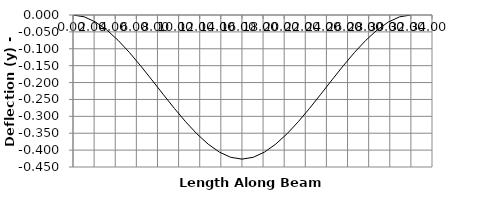
| Category | y |
|---|---|
| 0.0 | 0 |
| 0.0 | 0 |
| 1.0666666666666667 | -0.005 |
| 2.1333333333333333 | -0.021 |
| 3.2 | -0.044 |
| 4.266666666666667 | -0.075 |
| 5.333333333333333 | -0.111 |
| 6.4 | -0.15 |
| 7.466666666666667 | -0.192 |
| 8.533333333333333 | -0.235 |
| 9.6 | -0.276 |
| 10.666666666666666 | -0.316 |
| 11.733333333333333 | -0.352 |
| 12.8 | -0.382 |
| 13.866666666666667 | -0.406 |
| 14.933333333333334 | -0.421 |
| 15.999 | -0.427 |
| 16.0 | -0.427 |
| 16.001 | -0.427 |
| 17.066666666666666 | -0.421 |
| 18.133333333333333 | -0.406 |
| 19.2 | -0.382 |
| 20.266666666666666 | -0.352 |
| 21.333333333333332 | -0.316 |
| 22.4 | -0.276 |
| 23.466666666666665 | -0.235 |
| 24.53333333333333 | -0.192 |
| 25.6 | -0.15 |
| 26.666666666666668 | -0.111 |
| 27.733333333333334 | -0.075 |
| 28.8 | -0.044 |
| 29.866666666666667 | -0.021 |
| 30.933333333333334 | -0.005 |
| 32.0 | 0 |